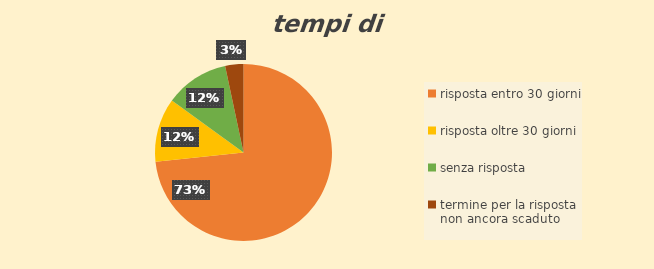
| Category | Series 0 |
|---|---|
| risposta entro 30 giorni | 44 |
| risposta oltre 30 giorni | 7 |
| senza risposta | 7 |
| termine per la risposta non ancora scaduto | 2 |